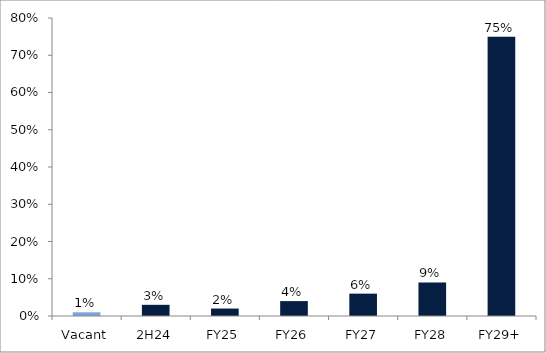
| Category | Series 0 |
|---|---|
| Vacant | 0.01 |
| 2H24 | 0.03 |
| FY25 | 0.02 |
| FY26 | 0.04 |
| FY27 | 0.06 |
| FY28 | 0.09 |
| FY29+ | 0.75 |